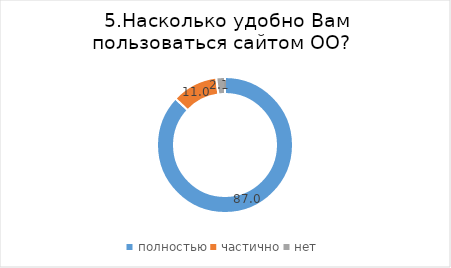
| Category | Series 0 |
|---|---|
| полностью | 86.983 |
| частично | 10.95 |
| нет | 2.066 |